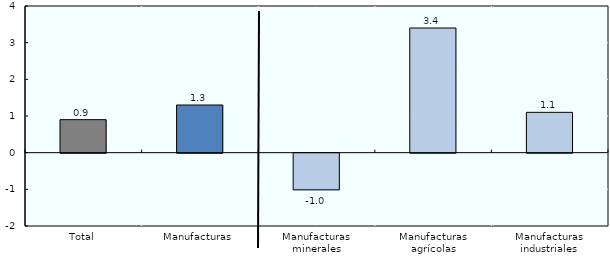
| Category | Series 0 |
|---|---|
| Total | 0.9 |
| Manufacturas | 1.3 |
| Manufacturas minerales | -1 |
| Manufacturas agrícolas | 3.4 |
| Manufacturas industriales | 1.1 |